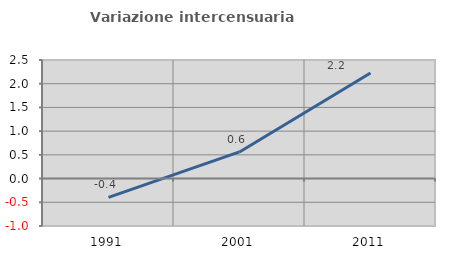
| Category | Variazione intercensuaria annua |
|---|---|
| 1991.0 | -0.397 |
| 2001.0 | 0.562 |
| 2011.0 | 2.227 |